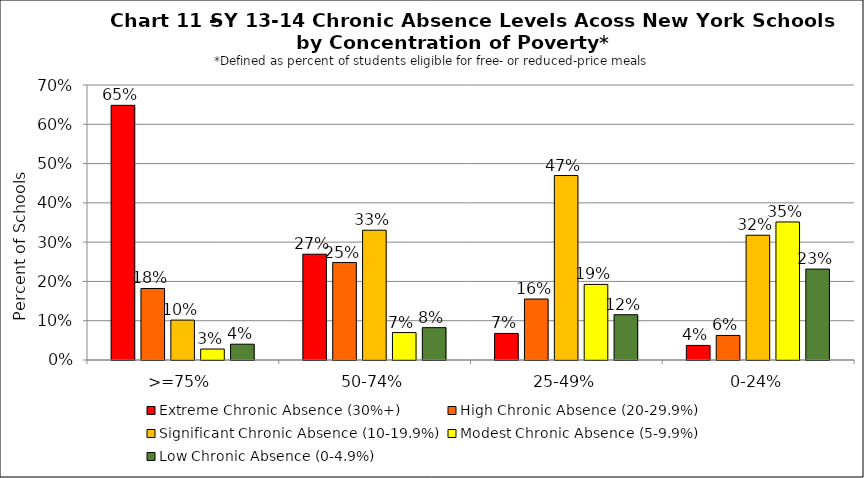
| Category | Extreme Chronic Absence (30%+) | High Chronic Absence (20-29.9%) | Significant Chronic Absence (10-19.9%) | Modest Chronic Absence (5-9.9%) | Low Chronic Absence (0-4.9%) |
|---|---|---|---|---|---|
| 0 | 0.648 | 0.182 | 0.102 | 0.028 | 0.04 |
| 1 | 0.269 | 0.248 | 0.33 | 0.07 | 0.082 |
| 2 | 0.068 | 0.155 | 0.47 | 0.192 | 0.115 |
| 3 | 0.037 | 0.062 | 0.318 | 0.351 | 0.231 |